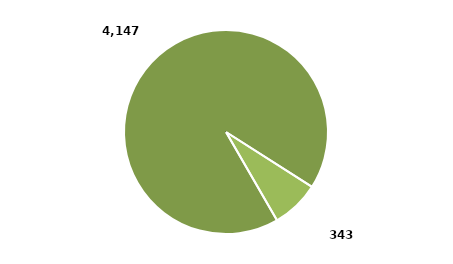
| Category | Series 0 |
|---|---|
| Hombres | 0.924 |
| Mujeres | 0.076 |